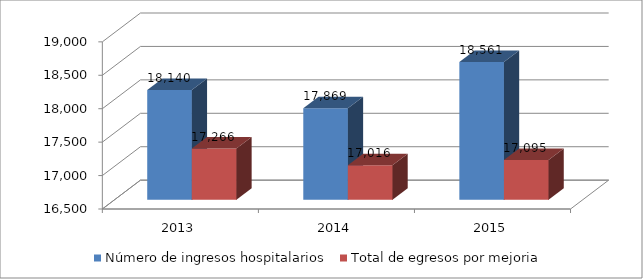
| Category | Número de ingresos hospitalarios | Total de egresos por mejoria |
|---|---|---|
| 2013 | 18140 | 17266 |
| 2014 | 17869 | 17016 |
| 2015 | 18561 | 17095 |